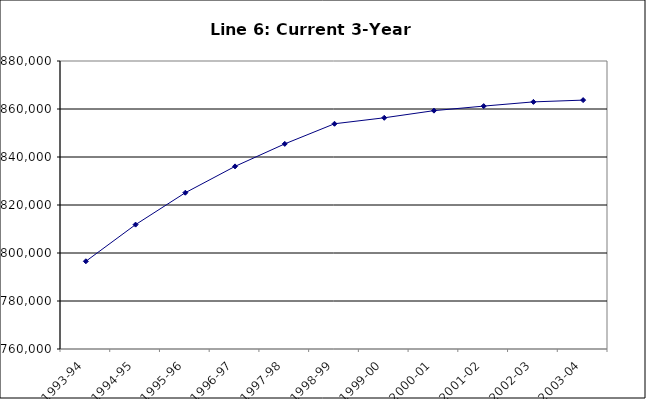
| Category | DISTRICT |
|---|---|
| 1993-94 | 796546 |
| 1994-95 | 811828 |
| 1995-96 | 825112 |
| 1996-97 | 836092 |
| 1997-98 | 845468 |
| 1998-99 | 853849 |
| 1999-00 | 856337 |
| 2000-01 | 859312 |
| 2001-02 | 861205 |
| 2002-03 | 862963 |
| 2003-04 | 863704 |